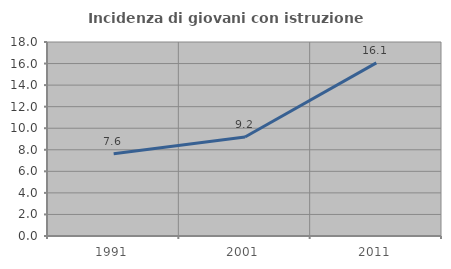
| Category | Incidenza di giovani con istruzione universitaria |
|---|---|
| 1991.0 | 7.635 |
| 2001.0 | 9.186 |
| 2011.0 | 16.063 |